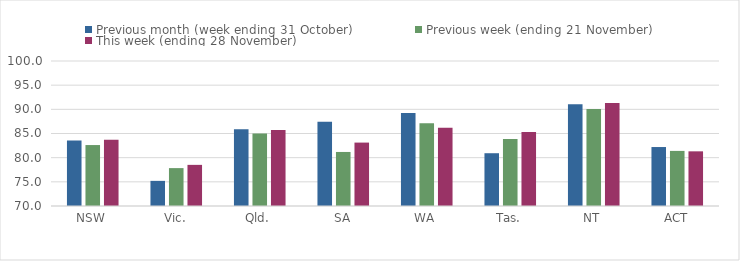
| Category | Previous month (week ending 31 October) | Previous week (ending 21 November) | This week (ending 28 November) |
|---|---|---|---|
| NSW | 83.53 | 82.61 | 83.72 |
| Vic. | 75.2 | 77.84 | 78.51 |
| Qld. | 85.88 | 85.02 | 85.73 |
| SA | 87.45 | 81.18 | 83.12 |
| WA | 89.22 | 87.13 | 86.2 |
| Tas. | 80.92 | 83.86 | 85.29 |
| NT | 91.05 | 90.08 | 91.31 |
| ACT | 82.2 | 81.4 | 81.31 |